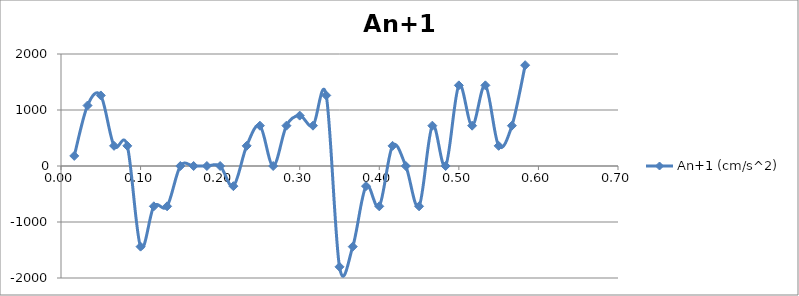
| Category | An+1 (cm/s^2) |
|---|---|
| 0.0166666666666667 | 180 |
| 0.0333333333333333 | 108 |
| 0.05 | 1260 |
| 0.0666666666666667 | 360 |
| 0.0833333333333333 | 360 |
| 0.1 | -1440 |
| 0.116666666666667 | -720 |
| 0.133333333333333 | -720 |
| 0.15 | 0 |
| 0.166666666666667 | 0 |
| 0.183333333333333 | 0 |
| 0.2 | 0 |
| 0.216666666666667 | -360 |
| 0.233333333333333 | 360 |
| 0.25 | 720 |
| 0.266666666666667 | 0 |
| 0.283333333333333 | 720 |
| 0.3 | 900 |
| 0.316666666666667 | 720 |
| 0.333333333333333 | 1260 |
| 0.35 | -1800 |
| 0.366666666666667 | -1440 |
| 0.383333333333333 | -360 |
| 0.4 | -720 |
| 0.416666666666667 | 360 |
| 0.433333333333333 | 0 |
| 0.45 | -720 |
| 0.466666666666667 | 720 |
| 0.483333333333333 | 0 |
| 0.5 | 1440 |
| 0.516666666666667 | 720 |
| 0.533333333333333 | 1440 |
| 0.55 | 360 |
| 0.566666666666667 | 720 |
| 0.583333333333333 | 1800 |